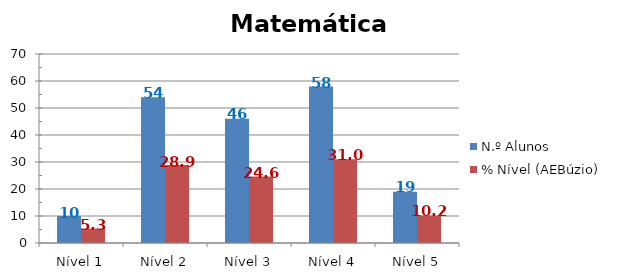
| Category | N.º Alunos | % Nível (AEBúzio) |
|---|---|---|
| Nível 1 | 10 | 5.348 |
| Nível 2 | 54 | 28.877 |
| Nível 3 | 46 | 24.599 |
| Nível 4 | 58 | 31.016 |
| Nível 5 | 19 | 10.16 |